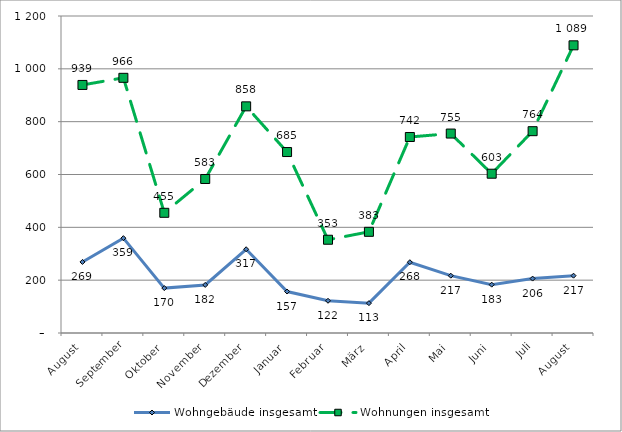
| Category | Wohngebäude insgesamt | Wohnungen insgesamt |
|---|---|---|
| August | 269 | 939 |
| September | 359 | 966 |
| Oktober | 170 | 455 |
| November | 182 | 583 |
| Dezember | 317 | 858 |
| Januar | 157 | 685 |
| Februar | 122 | 353 |
| März | 113 | 383 |
| April | 268 | 742 |
| Mai | 217 | 755 |
| Juni | 183 | 603 |
| Juli | 206 | 764 |
| August | 217 | 1089 |